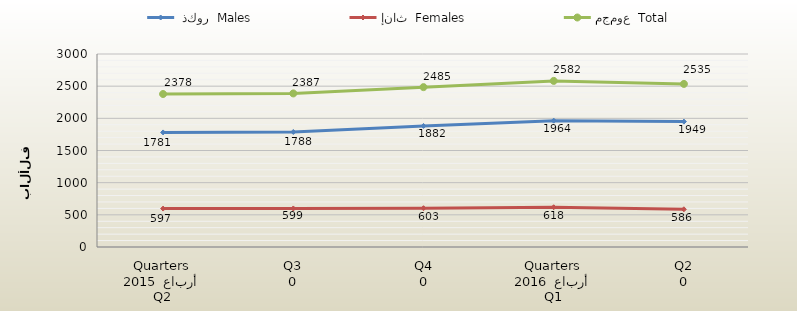
| Category |  ذكور  Males | إناث  Females | مجموع  Total |
|---|---|---|---|
| 0 | 1781 | 597 | 2378 |
| 1 | 1788 | 599 | 2387 |
| 2 | 1882 | 603 | 2485 |
| 3 | 1964 | 618 | 2582 |
| 4 | 1949 | 586 | 2535 |